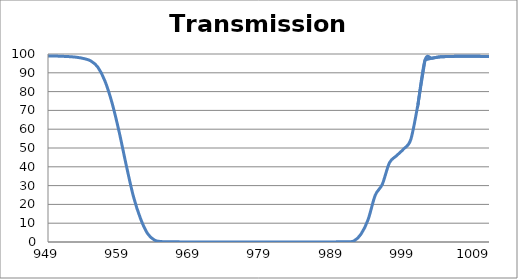
| Category | Transmission (%) |
|---|---|
| 2600.0 | 73.48 |
| 2599.0 | 73.645 |
| 2598.0 | 73.816 |
| 2597.0 | 73.891 |
| 2596.0 | 73.89 |
| 2595.0 | 73.862 |
| 2594.0 | 73.802 |
| 2593.0 | 73.691 |
| 2592.0 | 73.519 |
| 2591.0 | 73.297 |
| 2590.0 | 73.026 |
| 2589.0 | 72.665 |
| 2588.0 | 72.265 |
| 2587.0 | 71.8 |
| 2586.0 | 71.317 |
| 2585.0 | 70.806 |
| 2584.0 | 70.241 |
| 2583.0 | 69.645 |
| 2582.0 | 69.094 |
| 2581.0 | 68.533 |
| 2580.0 | 67.994 |
| 2579.0 | 67.481 |
| 2578.0 | 66.955 |
| 2577.0 | 66.455 |
| 2576.0 | 65.949 |
| 2575.0 | 65.496 |
| 2574.0 | 65.082 |
| 2573.0 | 64.707 |
| 2572.0 | 64.376 |
| 2571.0 | 64.076 |
| 2570.0 | 63.812 |
| 2569.0 | 63.601 |
| 2568.0 | 63.413 |
| 2567.0 | 63.256 |
| 2566.0 | 63.111 |
| 2565.0 | 62.979 |
| 2564.0 | 62.89 |
| 2563.0 | 62.814 |
| 2562.0 | 62.753 |
| 2561.0 | 62.719 |
| 2560.0 | 62.673 |
| 2559.0 | 62.64 |
| 2558.0 | 62.602 |
| 2557.0 | 62.563 |
| 2556.0 | 62.519 |
| 2555.0 | 62.472 |
| 2554.0 | 62.424 |
| 2553.0 | 62.378 |
| 2552.0 | 62.334 |
| 2551.0 | 62.303 |
| 2550.0 | 62.281 |
| 2549.0 | 62.283 |
| 2548.0 | 62.291 |
| 2547.0 | 62.346 |
| 2546.0 | 62.429 |
| 2545.0 | 62.564 |
| 2544.0 | 62.737 |
| 2543.0 | 62.965 |
| 2542.0 | 63.262 |
| 2541.0 | 63.615 |
| 2540.0 | 64.023 |
| 2539.0 | 64.515 |
| 2538.0 | 65.075 |
| 2537.0 | 65.663 |
| 2536.0 | 66.332 |
| 2535.0 | 67.04 |
| 2534.0 | 67.807 |
| 2533.0 | 68.609 |
| 2532.0 | 69.443 |
| 2531.0 | 70.247 |
| 2530.0 | 71.024 |
| 2529.0 | 71.798 |
| 2528.0 | 72.547 |
| 2527.0 | 73.227 |
| 2526.0 | 73.838 |
| 2525.0 | 74.342 |
| 2524.0 | 74.753 |
| 2523.0 | 75.061 |
| 2522.0 | 75.291 |
| 2521.0 | 75.414 |
| 2520.0 | 75.431 |
| 2519.0 | 75.343 |
| 2518.0 | 75.179 |
| 2517.0 | 74.941 |
| 2516.0 | 74.632 |
| 2515.0 | 74.277 |
| 2514.0 | 73.897 |
| 2513.0 | 73.502 |
| 2512.0 | 73.104 |
| 2511.0 | 72.762 |
| 2510.0 | 72.457 |
| 2509.0 | 72.216 |
| 2508.0 | 72.055 |
| 2507.0 | 71.998 |
| 2506.0 | 72.042 |
| 2505.0 | 72.205 |
| 2504.0 | 72.475 |
| 2503.0 | 72.874 |
| 2502.0 | 73.394 |
| 2501.0 | 74.021 |
| 2500.0 | 74.799 |
| 2499.0 | 75.648 |
| 2498.0 | 76.582 |
| 2497.0 | 77.574 |
| 2496.0 | 78.641 |
| 2495.0 | 79.709 |
| 2494.0 | 80.819 |
| 2493.0 | 81.905 |
| 2492.0 | 82.885 |
| 2491.0 | 83.83 |
| 2490.0 | 84.66 |
| 2489.0 | 85.374 |
| 2488.0 | 85.951 |
| 2487.0 | 86.399 |
| 2486.0 | 86.641 |
| 2485.0 | 86.753 |
| 2484.0 | 86.703 |
| 2483.0 | 86.487 |
| 2482.0 | 86.164 |
| 2481.0 | 85.706 |
| 2480.0 | 85.165 |
| 2479.0 | 84.574 |
| 2478.0 | 83.962 |
| 2477.0 | 83.313 |
| 2476.0 | 82.692 |
| 2475.0 | 82.105 |
| 2474.0 | 81.574 |
| 2473.0 | 81.156 |
| 2472.0 | 80.832 |
| 2471.0 | 80.618 |
| 2470.0 | 80.539 |
| 2469.0 | 80.588 |
| 2468.0 | 80.776 |
| 2467.0 | 81.104 |
| 2466.0 | 81.511 |
| 2465.0 | 82.063 |
| 2464.0 | 82.676 |
| 2463.0 | 83.356 |
| 2462.0 | 84.101 |
| 2461.0 | 84.879 |
| 2460.0 | 85.626 |
| 2459.0 | 86.305 |
| 2458.0 | 86.956 |
| 2457.0 | 87.514 |
| 2456.0 | 87.94 |
| 2455.0 | 88.262 |
| 2454.0 | 88.417 |
| 2453.0 | 88.401 |
| 2452.0 | 88.231 |
| 2451.0 | 87.897 |
| 2450.0 | 87.414 |
| 2449.0 | 86.792 |
| 2448.0 | 86.034 |
| 2447.0 | 85.212 |
| 2446.0 | 84.332 |
| 2445.0 | 83.421 |
| 2444.0 | 82.482 |
| 2443.0 | 81.568 |
| 2442.0 | 80.684 |
| 2441.0 | 79.868 |
| 2440.0 | 79.182 |
| 2439.0 | 78.57 |
| 2438.0 | 78.066 |
| 2437.0 | 77.67 |
| 2436.0 | 77.393 |
| 2435.0 | 77.236 |
| 2434.0 | 77.188 |
| 2433.0 | 77.232 |
| 2432.0 | 77.375 |
| 2431.0 | 77.585 |
| 2430.0 | 77.843 |
| 2429.0 | 78.139 |
| 2428.0 | 78.441 |
| 2427.0 | 78.725 |
| 2426.0 | 78.967 |
| 2425.0 | 79.174 |
| 2424.0 | 79.293 |
| 2423.0 | 79.322 |
| 2422.0 | 79.244 |
| 2421.0 | 79.073 |
| 2420.0 | 78.78 |
| 2419.0 | 78.386 |
| 2418.0 | 77.897 |
| 2417.0 | 77.31 |
| 2416.0 | 76.648 |
| 2415.0 | 75.953 |
| 2414.0 | 75.245 |
| 2413.0 | 74.509 |
| 2412.0 | 73.805 |
| 2411.0 | 73.144 |
| 2410.0 | 72.514 |
| 2409.0 | 71.986 |
| 2408.0 | 71.572 |
| 2407.0 | 71.254 |
| 2406.0 | 71.051 |
| 2405.0 | 70.975 |
| 2404.0 | 71.02 |
| 2403.0 | 71.213 |
| 2402.0 | 71.531 |
| 2401.0 | 71.955 |
| 2400.0 | 72.491 |
| 2399.0 | 73.141 |
| 2398.0 | 73.857 |
| 2397.0 | 74.664 |
| 2396.0 | 75.534 |
| 2395.0 | 76.355 |
| 2394.0 | 77.234 |
| 2393.0 | 78.05 |
| 2392.0 | 78.836 |
| 2391.0 | 79.577 |
| 2390.0 | 80.234 |
| 2389.0 | 80.783 |
| 2388.0 | 81.218 |
| 2387.0 | 81.554 |
| 2386.0 | 81.79 |
| 2385.0 | 81.924 |
| 2384.0 | 81.962 |
| 2383.0 | 81.937 |
| 2382.0 | 81.867 |
| 2381.0 | 81.743 |
| 2380.0 | 81.615 |
| 2379.0 | 81.516 |
| 2378.0 | 81.428 |
| 2377.0 | 81.401 |
| 2376.0 | 81.439 |
| 2375.0 | 81.558 |
| 2374.0 | 81.757 |
| 2373.0 | 82.072 |
| 2372.0 | 82.455 |
| 2371.0 | 82.949 |
| 2370.0 | 83.546 |
| 2369.0 | 84.166 |
| 2368.0 | 84.867 |
| 2367.0 | 85.596 |
| 2366.0 | 86.332 |
| 2365.0 | 87.086 |
| 2364.0 | 87.778 |
| 2363.0 | 88.403 |
| 2362.0 | 88.924 |
| 2361.0 | 89.36 |
| 2360.0 | 89.672 |
| 2359.0 | 89.865 |
| 2358.0 | 89.915 |
| 2357.0 | 89.815 |
| 2356.0 | 89.611 |
| 2355.0 | 89.287 |
| 2354.0 | 88.859 |
| 2353.0 | 88.369 |
| 2352.0 | 87.81 |
| 2351.0 | 87.214 |
| 2350.0 | 86.666 |
| 2349.0 | 86.13 |
| 2348.0 | 85.616 |
| 2347.0 | 85.165 |
| 2346.0 | 84.815 |
| 2345.0 | 84.521 |
| 2344.0 | 84.316 |
| 2343.0 | 84.219 |
| 2342.0 | 84.184 |
| 2341.0 | 84.228 |
| 2340.0 | 84.344 |
| 2339.0 | 84.488 |
| 2338.0 | 84.649 |
| 2337.0 | 84.813 |
| 2336.0 | 84.971 |
| 2335.0 | 85.062 |
| 2334.0 | 85.102 |
| 2333.0 | 85.073 |
| 2332.0 | 84.92 |
| 2331.0 | 84.688 |
| 2330.0 | 84.342 |
| 2329.0 | 83.886 |
| 2328.0 | 83.319 |
| 2327.0 | 82.695 |
| 2326.0 | 81.967 |
| 2325.0 | 81.157 |
| 2324.0 | 80.389 |
| 2323.0 | 79.572 |
| 2322.0 | 78.752 |
| 2321.0 | 77.996 |
| 2320.0 | 77.27 |
| 2319.0 | 76.609 |
| 2318.0 | 76.034 |
| 2317.0 | 75.582 |
| 2316.0 | 75.2 |
| 2315.0 | 74.91 |
| 2314.0 | 74.72 |
| 2313.0 | 74.625 |
| 2312.0 | 74.594 |
| 2311.0 | 74.645 |
| 2310.0 | 74.748 |
| 2309.0 | 74.876 |
| 2308.0 | 75.006 |
| 2307.0 | 75.158 |
| 2306.0 | 75.267 |
| 2305.0 | 75.321 |
| 2304.0 | 75.345 |
| 2303.0 | 75.289 |
| 2302.0 | 75.146 |
| 2301.0 | 74.937 |
| 2300.0 | 74.641 |
| 2299.0 | 74.253 |
| 2298.0 | 73.844 |
| 2297.0 | 73.347 |
| 2296.0 | 72.811 |
| 2295.0 | 72.238 |
| 2294.0 | 71.664 |
| 2293.0 | 71.085 |
| 2292.0 | 70.544 |
| 2291.0 | 70.058 |
| 2290.0 | 69.624 |
| 2289.0 | 69.247 |
| 2288.0 | 68.959 |
| 2287.0 | 68.758 |
| 2286.0 | 68.652 |
| 2285.0 | 68.634 |
| 2284.0 | 68.744 |
| 2283.0 | 68.923 |
| 2282.0 | 69.189 |
| 2281.0 | 69.565 |
| 2280.0 | 70.014 |
| 2279.0 | 70.476 |
| 2278.0 | 71.038 |
| 2277.0 | 71.641 |
| 2276.0 | 72.264 |
| 2275.0 | 72.927 |
| 2274.0 | 73.6 |
| 2273.0 | 74.25 |
| 2272.0 | 74.836 |
| 2271.0 | 75.431 |
| 2270.0 | 75.963 |
| 2269.0 | 76.422 |
| 2268.0 | 76.846 |
| 2267.0 | 77.219 |
| 2266.0 | 77.503 |
| 2265.0 | 77.741 |
| 2264.0 | 77.924 |
| 2263.0 | 78.06 |
| 2262.0 | 78.161 |
| 2261.0 | 78.226 |
| 2260.0 | 78.261 |
| 2259.0 | 78.273 |
| 2258.0 | 78.264 |
| 2257.0 | 78.247 |
| 2256.0 | 78.216 |
| 2255.0 | 78.173 |
| 2254.0 | 78.124 |
| 2253.0 | 78.062 |
| 2252.0 | 77.989 |
| 2251.0 | 77.913 |
| 2250.0 | 77.819 |
| 2249.0 | 77.701 |
| 2248.0 | 77.565 |
| 2247.0 | 77.428 |
| 2246.0 | 77.262 |
| 2245.0 | 77.087 |
| 2244.0 | 76.902 |
| 2243.0 | 76.699 |
| 2242.0 | 76.494 |
| 2241.0 | 76.286 |
| 2240.0 | 76.1 |
| 2239.0 | 75.902 |
| 2238.0 | 75.727 |
| 2237.0 | 75.577 |
| 2236.0 | 75.43 |
| 2235.0 | 75.314 |
| 2234.0 | 75.229 |
| 2233.0 | 75.156 |
| 2232.0 | 75.091 |
| 2231.0 | 75.046 |
| 2230.0 | 74.994 |
| 2229.0 | 74.944 |
| 2228.0 | 74.886 |
| 2227.0 | 74.808 |
| 2226.0 | 74.685 |
| 2225.0 | 74.539 |
| 2224.0 | 74.351 |
| 2223.0 | 74.108 |
| 2222.0 | 73.822 |
| 2221.0 | 73.502 |
| 2220.0 | 73.138 |
| 2219.0 | 72.728 |
| 2218.0 | 72.288 |
| 2217.0 | 71.837 |
| 2216.0 | 71.35 |
| 2215.0 | 70.902 |
| 2214.0 | 70.453 |
| 2213.0 | 70.024 |
| 2212.0 | 69.616 |
| 2211.0 | 69.269 |
| 2210.0 | 68.939 |
| 2209.0 | 68.655 |
| 2208.0 | 68.435 |
| 2207.0 | 68.238 |
| 2206.0 | 68.068 |
| 2205.0 | 67.94 |
| 2204.0 | 67.816 |
| 2203.0 | 67.692 |
| 2202.0 | 67.549 |
| 2201.0 | 67.406 |
| 2200.0 | 67.214 |
| 2199.0 | 66.971 |
| 2198.0 | 66.693 |
| 2197.0 | 66.351 |
| 2196.0 | 65.948 |
| 2195.0 | 65.509 |
| 2194.0 | 65.024 |
| 2193.0 | 64.483 |
| 2192.0 | 63.94 |
| 2191.0 | 63.362 |
| 2190.0 | 62.793 |
| 2189.0 | 62.258 |
| 2188.0 | 61.761 |
| 2187.0 | 61.277 |
| 2186.0 | 60.868 |
| 2185.0 | 60.537 |
| 2184.0 | 60.243 |
| 2183.0 | 60.035 |
| 2182.0 | 59.906 |
| 2181.0 | 59.826 |
| 2180.0 | 59.809 |
| 2179.0 | 59.844 |
| 2178.0 | 59.92 |
| 2177.0 | 60.008 |
| 2176.0 | 60.11 |
| 2175.0 | 60.217 |
| 2174.0 | 60.302 |
| 2173.0 | 60.358 |
| 2172.0 | 60.383 |
| 2171.0 | 60.359 |
| 2170.0 | 60.28 |
| 2169.0 | 60.165 |
| 2168.0 | 60.013 |
| 2167.0 | 59.803 |
| 2166.0 | 59.594 |
| 2165.0 | 59.365 |
| 2164.0 | 59.128 |
| 2163.0 | 58.923 |
| 2162.0 | 58.749 |
| 2161.0 | 58.607 |
| 2160.0 | 58.517 |
| 2159.0 | 58.501 |
| 2158.0 | 58.539 |
| 2157.0 | 58.665 |
| 2156.0 | 58.853 |
| 2155.0 | 59.108 |
| 2154.0 | 59.414 |
| 2153.0 | 59.765 |
| 2152.0 | 60.166 |
| 2151.0 | 60.567 |
| 2150.0 | 60.958 |
| 2149.0 | 61.335 |
| 2148.0 | 61.674 |
| 2147.0 | 61.95 |
| 2146.0 | 62.184 |
| 2145.0 | 62.34 |
| 2144.0 | 62.414 |
| 2143.0 | 62.418 |
| 2142.0 | 62.358 |
| 2141.0 | 62.243 |
| 2140.0 | 62.091 |
| 2139.0 | 61.909 |
| 2138.0 | 61.715 |
| 2137.0 | 61.548 |
| 2136.0 | 61.387 |
| 2135.0 | 61.267 |
| 2134.0 | 61.195 |
| 2133.0 | 61.173 |
| 2132.0 | 61.205 |
| 2131.0 | 61.277 |
| 2130.0 | 61.378 |
| 2129.0 | 61.521 |
| 2128.0 | 61.647 |
| 2127.0 | 61.766 |
| 2126.0 | 61.852 |
| 2125.0 | 61.882 |
| 2124.0 | 61.822 |
| 2123.0 | 61.689 |
| 2122.0 | 61.444 |
| 2121.0 | 61.105 |
| 2120.0 | 60.643 |
| 2119.0 | 60.122 |
| 2118.0 | 59.53 |
| 2117.0 | 58.871 |
| 2116.0 | 58.2 |
| 2115.0 | 57.515 |
| 2114.0 | 56.831 |
| 2113.0 | 56.22 |
| 2112.0 | 55.701 |
| 2111.0 | 55.265 |
| 2110.0 | 54.931 |
| 2109.0 | 54.726 |
| 2108.0 | 54.636 |
| 2107.0 | 54.646 |
| 2106.0 | 54.795 |
| 2105.0 | 55.013 |
| 2104.0 | 55.291 |
| 2103.0 | 55.623 |
| 2102.0 | 55.955 |
| 2101.0 | 56.256 |
| 2100.0 | 56.51 |
| 2099.0 | 56.663 |
| 2098.0 | 56.703 |
| 2097.0 | 56.618 |
| 2096.0 | 56.375 |
| 2095.0 | 55.997 |
| 2094.0 | 55.463 |
| 2093.0 | 54.796 |
| 2092.0 | 54.087 |
| 2091.0 | 53.266 |
| 2090.0 | 52.402 |
| 2089.0 | 51.536 |
| 2088.0 | 50.681 |
| 2087.0 | 49.887 |
| 2086.0 | 49.203 |
| 2085.0 | 48.611 |
| 2084.0 | 48.133 |
| 2083.0 | 47.773 |
| 2082.0 | 47.553 |
| 2081.0 | 47.446 |
| 2080.0 | 47.465 |
| 2079.0 | 47.586 |
| 2078.0 | 47.769 |
| 2077.0 | 48.042 |
| 2076.0 | 48.322 |
| 2075.0 | 48.636 |
| 2074.0 | 48.939 |
| 2073.0 | 49.193 |
| 2072.0 | 49.405 |
| 2071.0 | 49.546 |
| 2070.0 | 49.627 |
| 2069.0 | 49.628 |
| 2068.0 | 49.558 |
| 2067.0 | 49.439 |
| 2066.0 | 49.283 |
| 2065.0 | 49.1 |
| 2064.0 | 48.902 |
| 2063.0 | 48.734 |
| 2062.0 | 48.599 |
| 2061.0 | 48.511 |
| 2060.0 | 48.518 |
| 2059.0 | 48.582 |
| 2058.0 | 48.739 |
| 2057.0 | 48.976 |
| 2056.0 | 49.307 |
| 2055.0 | 49.702 |
| 2054.0 | 50.144 |
| 2053.0 | 50.632 |
| 2052.0 | 51.136 |
| 2051.0 | 51.632 |
| 2050.0 | 52.117 |
| 2049.0 | 52.567 |
| 2048.0 | 52.96 |
| 2047.0 | 53.273 |
| 2046.0 | 53.521 |
| 2045.0 | 53.683 |
| 2044.0 | 53.789 |
| 2043.0 | 53.816 |
| 2042.0 | 53.798 |
| 2041.0 | 53.727 |
| 2040.0 | 53.64 |
| 2039.0 | 53.522 |
| 2038.0 | 53.4 |
| 2037.0 | 53.277 |
| 2036.0 | 53.157 |
| 2035.0 | 53.04 |
| 2034.0 | 52.923 |
| 2033.0 | 52.807 |
| 2032.0 | 52.655 |
| 2031.0 | 52.485 |
| 2030.0 | 52.274 |
| 2029.0 | 52.01 |
| 2028.0 | 51.693 |
| 2027.0 | 51.311 |
| 2026.0 | 50.866 |
| 2025.0 | 50.344 |
| 2024.0 | 49.755 |
| 2023.0 | 49.111 |
| 2022.0 | 48.435 |
| 2021.0 | 47.736 |
| 2020.0 | 46.988 |
| 2019.0 | 46.234 |
| 2018.0 | 45.482 |
| 2017.0 | 44.718 |
| 2016.0 | 43.971 |
| 2015.0 | 43.265 |
| 2014.0 | 42.573 |
| 2013.0 | 41.892 |
| 2012.0 | 41.252 |
| 2011.0 | 40.613 |
| 2010.0 | 40 |
| 2009.0 | 39.447 |
| 2008.0 | 38.922 |
| 2007.0 | 38.428 |
| 2006.0 | 37.958 |
| 2005.0 | 37.552 |
| 2004.0 | 37.187 |
| 2003.0 | 36.89 |
| 2002.0 | 36.679 |
| 2001.0 | 36.536 |
| 2000.0 | 36.471 |
| 1999.0 | 36.491 |
| 1998.0 | 36.598 |
| 1997.0 | 36.78 |
| 1996.0 | 37.019 |
| 1995.0 | 37.32 |
| 1994.0 | 37.652 |
| 1993.0 | 37.978 |
| 1992.0 | 38.287 |
| 1991.0 | 38.554 |
| 1990.0 | 38.732 |
| 1989.0 | 38.809 |
| 1988.0 | 38.761 |
| 1987.0 | 38.589 |
| 1986.0 | 38.28 |
| 1985.0 | 37.842 |
| 1984.0 | 37.296 |
| 1983.0 | 36.7 |
| 1982.0 | 36.034 |
| 1981.0 | 35.357 |
| 1980.0 | 34.705 |
| 1979.0 | 34.118 |
| 1978.0 | 33.615 |
| 1977.0 | 33.248 |
| 1976.0 | 33.027 |
| 1975.0 | 32.957 |
| 1974.0 | 33.064 |
| 1973.0 | 33.334 |
| 1972.0 | 33.793 |
| 1971.0 | 34.388 |
| 1970.0 | 35.086 |
| 1969.0 | 35.899 |
| 1968.0 | 36.766 |
| 1967.0 | 37.624 |
| 1966.0 | 38.481 |
| 1965.0 | 39.26 |
| 1964.0 | 39.862 |
| 1963.0 | 40.336 |
| 1962.0 | 40.614 |
| 1961.0 | 40.723 |
| 1960.0 | 40.645 |
| 1959.0 | 40.419 |
| 1958.0 | 40.09 |
| 1957.0 | 39.701 |
| 1956.0 | 39.291 |
| 1955.0 | 38.925 |
| 1954.0 | 38.632 |
| 1953.0 | 38.451 |
| 1952.0 | 38.431 |
| 1951.0 | 38.567 |
| 1950.0 | 38.859 |
| 1949.0 | 39.324 |
| 1948.0 | 39.913 |
| 1947.0 | 40.636 |
| 1946.0 | 41.44 |
| 1945.0 | 42.23 |
| 1944.0 | 43 |
| 1943.0 | 43.7 |
| 1942.0 | 44.296 |
| 1941.0 | 44.753 |
| 1940.0 | 45.045 |
| 1939.0 | 45.177 |
| 1938.0 | 45.166 |
| 1937.0 | 45.017 |
| 1936.0 | 44.8 |
| 1935.0 | 44.529 |
| 1934.0 | 44.26 |
| 1933.0 | 44.025 |
| 1932.0 | 43.872 |
| 1931.0 | 43.803 |
| 1930.0 | 43.819 |
| 1929.0 | 43.919 |
| 1928.0 | 44.088 |
| 1927.0 | 44.296 |
| 1926.0 | 44.494 |
| 1925.0 | 44.651 |
| 1924.0 | 44.719 |
| 1923.0 | 44.665 |
| 1922.0 | 44.485 |
| 1921.0 | 44.133 |
| 1920.0 | 43.624 |
| 1919.0 | 43.063 |
| 1918.0 | 42.412 |
| 1917.0 | 41.715 |
| 1916.0 | 41.006 |
| 1915.0 | 40.346 |
| 1914.0 | 39.767 |
| 1913.0 | 39.279 |
| 1912.0 | 38.946 |
| 1911.0 | 38.719 |
| 1910.0 | 38.645 |
| 1909.0 | 38.709 |
| 1908.0 | 38.873 |
| 1907.0 | 39.089 |
| 1906.0 | 39.337 |
| 1905.0 | 39.544 |
| 1904.0 | 39.689 |
| 1903.0 | 39.713 |
| 1902.0 | 39.589 |
| 1901.0 | 39.292 |
| 1900.0 | 38.857 |
| 1899.0 | 38.298 |
| 1898.0 | 37.655 |
| 1897.0 | 36.943 |
| 1896.0 | 36.262 |
| 1895.0 | 35.581 |
| 1894.0 | 35.01 |
| 1893.0 | 34.563 |
| 1892.0 | 34.223 |
| 1891.0 | 34.026 |
| 1890.0 | 33.987 |
| 1889.0 | 34.1 |
| 1888.0 | 34.355 |
| 1887.0 | 34.705 |
| 1886.0 | 35.122 |
| 1885.0 | 35.576 |
| 1884.0 | 36.002 |
| 1883.0 | 36.393 |
| 1882.0 | 36.692 |
| 1881.0 | 36.875 |
| 1880.0 | 36.933 |
| 1879.0 | 36.889 |
| 1878.0 | 36.755 |
| 1877.0 | 36.565 |
| 1876.0 | 36.362 |
| 1875.0 | 36.175 |
| 1874.0 | 36.07 |
| 1873.0 | 36.051 |
| 1872.0 | 36.172 |
| 1871.0 | 36.44 |
| 1870.0 | 36.842 |
| 1869.0 | 37.361 |
| 1868.0 | 37.97 |
| 1867.0 | 38.597 |
| 1866.0 | 39.245 |
| 1865.0 | 39.822 |
| 1864.0 | 40.298 |
| 1863.0 | 40.685 |
| 1862.0 | 40.88 |
| 1861.0 | 40.891 |
| 1860.0 | 40.724 |
| 1859.0 | 40.415 |
| 1858.0 | 40.002 |
| 1857.0 | 39.485 |
| 1856.0 | 38.953 |
| 1855.0 | 38.475 |
| 1854.0 | 38.068 |
| 1853.0 | 37.752 |
| 1852.0 | 37.53 |
| 1851.0 | 37.432 |
| 1850.0 | 37.427 |
| 1849.0 | 37.484 |
| 1848.0 | 37.567 |
| 1847.0 | 37.654 |
| 1846.0 | 37.695 |
| 1845.0 | 37.648 |
| 1844.0 | 37.472 |
| 1843.0 | 37.177 |
| 1842.0 | 36.763 |
| 1841.0 | 36.25 |
| 1840.0 | 35.65 |
| 1839.0 | 34.998 |
| 1838.0 | 34.375 |
| 1837.0 | 33.781 |
| 1836.0 | 33.323 |
| 1835.0 | 32.949 |
| 1834.0 | 32.681 |
| 1833.0 | 32.523 |
| 1832.0 | 32.469 |
| 1831.0 | 32.494 |
| 1830.0 | 32.57 |
| 1829.0 | 32.64 |
| 1828.0 | 32.683 |
| 1827.0 | 32.674 |
| 1826.0 | 32.569 |
| 1825.0 | 32.373 |
| 1824.0 | 32.071 |
| 1823.0 | 31.672 |
| 1822.0 | 31.22 |
| 1821.0 | 30.713 |
| 1820.0 | 30.221 |
| 1819.0 | 29.763 |
| 1818.0 | 29.384 |
| 1817.0 | 29.128 |
| 1816.0 | 28.99 |
| 1815.0 | 28.954 |
| 1814.0 | 29.041 |
| 1813.0 | 29.218 |
| 1812.0 | 29.471 |
| 1811.0 | 29.768 |
| 1810.0 | 30.065 |
| 1809.0 | 30.355 |
| 1808.0 | 30.581 |
| 1807.0 | 30.761 |
| 1806.0 | 30.855 |
| 1805.0 | 30.875 |
| 1804.0 | 30.842 |
| 1803.0 | 30.783 |
| 1802.0 | 30.718 |
| 1801.0 | 30.692 |
| 1800.0 | 30.738 |
| 1799.0 | 30.869 |
| 1798.0 | 31.112 |
| 1797.0 | 31.451 |
| 1796.0 | 31.889 |
| 1795.0 | 32.418 |
| 1794.0 | 32.994 |
| 1793.0 | 33.599 |
| 1792.0 | 34.193 |
| 1791.0 | 34.704 |
| 1790.0 | 35.138 |
| 1789.0 | 35.482 |
| 1788.0 | 35.727 |
| 1787.0 | 35.895 |
| 1786.0 | 35.999 |
| 1785.0 | 36.087 |
| 1784.0 | 36.197 |
| 1783.0 | 36.366 |
| 1782.0 | 36.616 |
| 1781.0 | 36.941 |
| 1780.0 | 37.381 |
| 1779.0 | 37.861 |
| 1778.0 | 38.345 |
| 1777.0 | 38.797 |
| 1776.0 | 39.159 |
| 1775.0 | 39.375 |
| 1774.0 | 39.415 |
| 1773.0 | 39.256 |
| 1772.0 | 38.923 |
| 1771.0 | 38.465 |
| 1770.0 | 37.926 |
| 1769.0 | 37.362 |
| 1768.0 | 36.889 |
| 1767.0 | 36.515 |
| 1766.0 | 36.324 |
| 1765.0 | 36.33 |
| 1764.0 | 36.524 |
| 1763.0 | 36.856 |
| 1762.0 | 37.279 |
| 1761.0 | 37.724 |
| 1760.0 | 38.062 |
| 1759.0 | 38.202 |
| 1758.0 | 38.083 |
| 1757.0 | 37.66 |
| 1756.0 | 36.921 |
| 1755.0 | 35.927 |
| 1754.0 | 34.727 |
| 1753.0 | 33.446 |
| 1752.0 | 32.251 |
| 1751.0 | 31.167 |
| 1750.0 | 30.255 |
| 1749.0 | 29.599 |
| 1748.0 | 29.217 |
| 1747.0 | 29.096 |
| 1746.0 | 29.197 |
| 1745.0 | 29.468 |
| 1744.0 | 29.817 |
| 1743.0 | 30.155 |
| 1742.0 | 30.37 |
| 1741.0 | 30.374 |
| 1740.0 | 30.1 |
| 1739.0 | 29.555 |
| 1738.0 | 28.755 |
| 1737.0 | 27.721 |
| 1736.0 | 26.61 |
| 1735.0 | 25.468 |
| 1734.0 | 24.448 |
| 1733.0 | 23.632 |
| 1732.0 | 23.056 |
| 1731.0 | 22.76 |
| 1730.0 | 22.768 |
| 1729.0 | 23.105 |
| 1728.0 | 23.776 |
| 1727.0 | 24.721 |
| 1726.0 | 25.904 |
| 1725.0 | 27.25 |
| 1724.0 | 28.686 |
| 1723.0 | 30.003 |
| 1722.0 | 31.185 |
| 1721.0 | 31.984 |
| 1720.0 | 32.376 |
| 1719.0 | 32.389 |
| 1718.0 | 32.05 |
| 1717.0 | 31.492 |
| 1716.0 | 30.82 |
| 1715.0 | 30.206 |
| 1714.0 | 29.764 |
| 1713.0 | 29.576 |
| 1712.0 | 29.691 |
| 1711.0 | 30.145 |
| 1710.0 | 30.944 |
| 1709.0 | 32.072 |
| 1708.0 | 33.432 |
| 1707.0 | 34.92 |
| 1706.0 | 36.458 |
| 1705.0 | 37.972 |
| 1704.0 | 39.232 |
| 1703.0 | 40.302 |
| 1702.0 | 41.025 |
| 1701.0 | 41.409 |
| 1700.0 | 41.555 |
| 1699.0 | 41.537 |
| 1698.0 | 41.452 |
| 1697.0 | 41.368 |
| 1696.0 | 41.366 |
| 1695.0 | 41.489 |
| 1694.0 | 41.704 |
| 1693.0 | 42.037 |
| 1692.0 | 42.43 |
| 1691.0 | 42.827 |
| 1690.0 | 43.21 |
| 1689.0 | 43.545 |
| 1688.0 | 43.802 |
| 1687.0 | 44.024 |
| 1686.0 | 44.222 |
| 1685.0 | 44.41 |
| 1684.0 | 44.603 |
| 1683.0 | 44.781 |
| 1682.0 | 44.894 |
| 1681.0 | 44.878 |
| 1680.0 | 44.665 |
| 1679.0 | 44.163 |
| 1678.0 | 43.343 |
| 1677.0 | 42.157 |
| 1676.0 | 40.698 |
| 1675.0 | 39.156 |
| 1674.0 | 37.481 |
| 1673.0 | 35.91 |
| 1672.0 | 34.585 |
| 1671.0 | 33.565 |
| 1670.0 | 32.98 |
| 1669.0 | 32.85 |
| 1668.0 | 33.169 |
| 1667.0 | 33.923 |
| 1666.0 | 35.025 |
| 1665.0 | 36.317 |
| 1664.0 | 37.601 |
| 1663.0 | 38.577 |
| 1662.0 | 39.037 |
| 1661.0 | 38.838 |
| 1660.0 | 37.92 |
| 1659.0 | 36.431 |
| 1658.0 | 34.449 |
| 1657.0 | 32.342 |
| 1656.0 | 30.523 |
| 1655.0 | 28.921 |
| 1654.0 | 27.803 |
| 1653.0 | 27.229 |
| 1652.0 | 27.244 |
| 1651.0 | 27.883 |
| 1650.0 | 29.114 |
| 1649.0 | 30.819 |
| 1648.0 | 32.986 |
| 1647.0 | 35.299 |
| 1646.0 | 37.463 |
| 1645.0 | 39.205 |
| 1644.0 | 40.152 |
| 1643.0 | 40.212 |
| 1642.0 | 39.447 |
| 1641.0 | 38.04 |
| 1640.0 | 36.405 |
| 1639.0 | 34.753 |
| 1638.0 | 33.49 |
| 1637.0 | 32.825 |
| 1636.0 | 32.803 |
| 1635.0 | 33.487 |
| 1634.0 | 34.872 |
| 1633.0 | 36.909 |
| 1632.0 | 39.484 |
| 1631.0 | 42.211 |
| 1630.0 | 44.684 |
| 1629.0 | 46.726 |
| 1628.0 | 47.919 |
| 1627.0 | 48.192 |
| 1626.0 | 47.626 |
| 1625.0 | 46.531 |
| 1624.0 | 45.318 |
| 1623.0 | 44.301 |
| 1622.0 | 43.745 |
| 1621.0 | 43.821 |
| 1620.0 | 44.573 |
| 1619.0 | 45.883 |
| 1618.0 | 47.385 |
| 1617.0 | 48.779 |
| 1616.0 | 49.629 |
| 1615.0 | 49.591 |
| 1614.0 | 48.502 |
| 1613.0 | 46.365 |
| 1612.0 | 43.556 |
| 1611.0 | 40.687 |
| 1610.0 | 37.804 |
| 1609.0 | 35.495 |
| 1608.0 | 33.873 |
| 1607.0 | 33.002 |
| 1606.0 | 32.979 |
| 1605.0 | 33.708 |
| 1604.0 | 35.095 |
| 1603.0 | 37.071 |
| 1602.0 | 39.24 |
| 1601.0 | 41.377 |
| 1600.0 | 43 |
| 1599.0 | 43.694 |
| 1598.0 | 43.379 |
| 1597.0 | 42.133 |
| 1596.0 | 40.188 |
| 1595.0 | 38.052 |
| 1594.0 | 35.939 |
| 1593.0 | 34.275 |
| 1592.0 | 33.287 |
| 1591.0 | 32.923 |
| 1590.0 | 33.279 |
| 1589.0 | 34.305 |
| 1588.0 | 35.945 |
| 1587.0 | 38.139 |
| 1586.0 | 40.568 |
| 1585.0 | 42.979 |
| 1584.0 | 45.254 |
| 1583.0 | 47.091 |
| 1582.0 | 48.339 |
| 1581.0 | 49.033 |
| 1580.0 | 49.276 |
| 1579.0 | 49.316 |
| 1578.0 | 49.393 |
| 1577.0 | 49.702 |
| 1576.0 | 50.337 |
| 1575.0 | 51.377 |
| 1574.0 | 52.737 |
| 1573.0 | 54.135 |
| 1572.0 | 55.579 |
| 1571.0 | 56.823 |
| 1570.0 | 57.765 |
| 1569.0 | 58.328 |
| 1568.0 | 58.569 |
| 1567.0 | 58.615 |
| 1566.0 | 58.613 |
| 1565.0 | 58.678 |
| 1564.0 | 58.881 |
| 1563.0 | 59.173 |
| 1562.0 | 59.424 |
| 1561.0 | 59.438 |
| 1560.0 | 59.053 |
| 1559.0 | 58.105 |
| 1558.0 | 56.571 |
| 1557.0 | 54.63 |
| 1556.0 | 52.341 |
| 1555.0 | 50.112 |
| 1554.0 | 48.276 |
| 1553.0 | 46.907 |
| 1552.0 | 46.218 |
| 1551.0 | 46.264 |
| 1550.0 | 47.051 |
| 1549.0 | 48.579 |
| 1548.0 | 50.581 |
| 1547.0 | 52.719 |
| 1546.0 | 54.792 |
| 1545.0 | 56.331 |
| 1544.0 | 57.04 |
| 1543.0 | 56.744 |
| 1542.0 | 55.582 |
| 1541.0 | 53.877 |
| 1540.0 | 51.982 |
| 1539.0 | 50.244 |
| 1538.0 | 49.017 |
| 1537.0 | 48.45 |
| 1536.0 | 48.669 |
| 1535.0 | 49.626 |
| 1534.0 | 51.296 |
| 1533.0 | 53.458 |
| 1532.0 | 55.927 |
| 1531.0 | 58.353 |
| 1530.0 | 60.519 |
| 1529.0 | 62.029 |
| 1528.0 | 62.816 |
| 1527.0 | 63.036 |
| 1526.0 | 62.773 |
| 1525.0 | 62.319 |
| 1524.0 | 61.935 |
| 1523.0 | 61.788 |
| 1522.0 | 62.013 |
| 1521.0 | 62.581 |
| 1520.0 | 63.457 |
| 1519.0 | 64.441 |
| 1518.0 | 65.451 |
| 1517.0 | 66.289 |
| 1516.0 | 66.846 |
| 1515.0 | 67.138 |
| 1514.0 | 67.223 |
| 1513.0 | 67.183 |
| 1512.0 | 67.175 |
| 1511.0 | 67.293 |
| 1510.0 | 67.577 |
| 1509.0 | 67.965 |
| 1508.0 | 68.442 |
| 1507.0 | 68.846 |
| 1506.0 | 69.046 |
| 1505.0 | 68.973 |
| 1504.0 | 68.566 |
| 1503.0 | 67.906 |
| 1502.0 | 67.157 |
| 1501.0 | 66.42 |
| 1500.0 | 65.888 |
| 1499.0 | 65.733 |
| 1498.0 | 66.032 |
| 1497.0 | 66.782 |
| 1496.0 | 67.881 |
| 1495.0 | 69.194 |
| 1494.0 | 70.564 |
| 1493.0 | 71.671 |
| 1492.0 | 72.423 |
| 1491.0 | 72.618 |
| 1490.0 | 72.297 |
| 1489.0 | 71.589 |
| 1488.0 | 70.686 |
| 1487.0 | 69.801 |
| 1486.0 | 69.148 |
| 1485.0 | 68.887 |
| 1484.0 | 69.076 |
| 1483.0 | 69.623 |
| 1482.0 | 70.517 |
| 1481.0 | 71.577 |
| 1480.0 | 72.547 |
| 1479.0 | 73.31 |
| 1478.0 | 73.695 |
| 1477.0 | 73.658 |
| 1476.0 | 73.323 |
| 1475.0 | 72.793 |
| 1474.0 | 72.271 |
| 1473.0 | 71.892 |
| 1472.0 | 71.812 |
| 1471.0 | 72.057 |
| 1470.0 | 72.587 |
| 1469.0 | 73.329 |
| 1468.0 | 74.138 |
| 1467.0 | 74.821 |
| 1466.0 | 75.31 |
| 1465.0 | 75.461 |
| 1464.0 | 75.337 |
| 1463.0 | 75.019 |
| 1462.0 | 74.663 |
| 1461.0 | 74.401 |
| 1460.0 | 74.375 |
| 1459.0 | 74.654 |
| 1458.0 | 75.191 |
| 1457.0 | 75.914 |
| 1456.0 | 76.713 |
| 1455.0 | 77.406 |
| 1454.0 | 77.885 |
| 1453.0 | 78.078 |
| 1452.0 | 78.011 |
| 1451.0 | 77.791 |
| 1450.0 | 77.576 |
| 1449.0 | 77.502 |
| 1448.0 | 77.672 |
| 1447.0 | 78.154 |
| 1446.0 | 78.918 |
| 1445.0 | 79.751 |
| 1444.0 | 80.572 |
| 1443.0 | 81.16 |
| 1442.0 | 81.414 |
| 1441.0 | 81.323 |
| 1440.0 | 80.948 |
| 1439.0 | 80.496 |
| 1438.0 | 80.139 |
| 1437.0 | 80.034 |
| 1436.0 | 80.314 |
| 1435.0 | 80.956 |
| 1434.0 | 81.892 |
| 1433.0 | 82.882 |
| 1432.0 | 83.728 |
| 1431.0 | 84.216 |
| 1430.0 | 84.265 |
| 1429.0 | 83.888 |
| 1428.0 | 83.189 |
| 1427.0 | 82.447 |
| 1426.0 | 81.931 |
| 1425.0 | 81.765 |
| 1424.0 | 82.037 |
| 1423.0 | 82.728 |
| 1422.0 | 83.663 |
| 1421.0 | 84.638 |
| 1420.0 | 85.436 |
| 1419.0 | 85.859 |
| 1418.0 | 85.89 |
| 1417.0 | 85.599 |
| 1416.0 | 85.164 |
| 1415.0 | 84.748 |
| 1414.0 | 84.566 |
| 1413.0 | 84.708 |
| 1412.0 | 85.143 |
| 1411.0 | 85.76 |
| 1410.0 | 86.441 |
| 1409.0 | 86.997 |
| 1408.0 | 87.296 |
| 1407.0 | 87.352 |
| 1406.0 | 87.254 |
| 1405.0 | 87.121 |
| 1404.0 | 87.105 |
| 1403.0 | 87.273 |
| 1402.0 | 87.572 |
| 1401.0 | 87.899 |
| 1400.0 | 88.055 |
| 1399.0 | 87.889 |
| 1398.0 | 87.309 |
| 1397.0 | 86.399 |
| 1396.0 | 85.241 |
| 1395.0 | 84.259 |
| 1394.0 | 83.769 |
| 1393.0 | 83.974 |
| 1392.0 | 84.878 |
| 1391.0 | 86.355 |
| 1390.0 | 88.119 |
| 1389.0 | 89.753 |
| 1388.0 | 90.811 |
| 1387.0 | 91.06 |
| 1386.0 | 90.432 |
| 1385.0 | 89.195 |
| 1384.0 | 87.743 |
| 1383.0 | 86.553 |
| 1382.0 | 86.061 |
| 1381.0 | 86.417 |
| 1380.0 | 87.611 |
| 1379.0 | 89.178 |
| 1378.0 | 90.777 |
| 1377.0 | 91.894 |
| 1376.0 | 92.178 |
| 1375.0 | 91.533 |
| 1374.0 | 90.256 |
| 1373.0 | 88.759 |
| 1372.0 | 87.563 |
| 1371.0 | 87.061 |
| 1370.0 | 87.467 |
| 1369.0 | 88.66 |
| 1368.0 | 90.352 |
| 1367.0 | 91.975 |
| 1366.0 | 93.123 |
| 1365.0 | 93.392 |
| 1364.0 | 92.864 |
| 1363.0 | 91.711 |
| 1362.0 | 90.48 |
| 1361.0 | 89.515 |
| 1360.0 | 89.235 |
| 1359.0 | 89.781 |
| 1358.0 | 90.966 |
| 1357.0 | 92.422 |
| 1356.0 | 93.63 |
| 1355.0 | 94.17 |
| 1354.0 | 93.843 |
| 1353.0 | 92.702 |
| 1352.0 | 91.066 |
| 1351.0 | 89.434 |
| 1350.0 | 88.395 |
| 1349.0 | 88.144 |
| 1348.0 | 88.817 |
| 1347.0 | 90.281 |
| 1346.0 | 92.125 |
| 1345.0 | 94.049 |
| 1344.0 | 95.513 |
| 1343.0 | 96.216 |
| 1342.0 | 96.205 |
| 1341.0 | 95.637 |
| 1340.0 | 94.862 |
| 1339.0 | 94.164 |
| 1338.0 | 93.866 |
| 1337.0 | 94.052 |
| 1336.0 | 94.612 |
| 1335.0 | 95.487 |
| 1334.0 | 96.434 |
| 1333.0 | 97.307 |
| 1332.0 | 97.988 |
| 1331.0 | 98.418 |
| 1330.0 | 98.648 |
| 1329.0 | 98.714 |
| 1328.0 | 98.753 |
| 1327.0 | 98.742 |
| 1326.0 | 98.734 |
| 1325.0 | 98.733 |
| 1324.0 | 98.74 |
| 1323.0 | 98.731 |
| 1322.0 | 98.725 |
| 1321.0 | 98.758 |
| 1320.0 | 98.815 |
| 1319.0 | 98.909 |
| 1318.0 | 99.024 |
| 1317.0 | 99.105 |
| 1316.0 | 99.183 |
| 1315.0 | 99.223 |
| 1314.0 | 99.231 |
| 1313.0 | 99.207 |
| 1312.0 | 99.2 |
| 1311.0 | 99.218 |
| 1310.0 | 99.225 |
| 1309.0 | 99.266 |
| 1308.0 | 99.302 |
| 1307.0 | 99.32 |
| 1306.0 | 99.344 |
| 1305.0 | 99.354 |
| 1304.0 | 99.389 |
| 1303.0 | 99.422 |
| 1302.0 | 99.471 |
| 1301.0 | 99.515 |
| 1300.0 | 99.525 |
| 1299.0 | 99.522 |
| 1298.0 | 99.483 |
| 1297.0 | 99.413 |
| 1296.0 | 99.346 |
| 1295.0 | 99.323 |
| 1294.0 | 99.321 |
| 1293.0 | 99.344 |
| 1292.0 | 99.392 |
| 1291.0 | 99.447 |
| 1290.0 | 99.48 |
| 1289.0 | 99.521 |
| 1288.0 | 99.535 |
| 1287.0 | 99.545 |
| 1286.0 | 99.557 |
| 1285.0 | 99.578 |
| 1284.0 | 99.578 |
| 1283.0 | 99.566 |
| 1282.0 | 99.547 |
| 1281.0 | 99.511 |
| 1280.0 | 99.462 |
| 1279.0 | 99.449 |
| 1278.0 | 99.424 |
| 1277.0 | 99.417 |
| 1276.0 | 99.446 |
| 1275.0 | 99.473 |
| 1274.0 | 99.484 |
| 1273.0 | 99.493 |
| 1272.0 | 99.501 |
| 1271.0 | 99.506 |
| 1270.0 | 99.515 |
| 1269.0 | 99.542 |
| 1268.0 | 99.565 |
| 1267.0 | 99.571 |
| 1266.0 | 99.573 |
| 1265.0 | 99.533 |
| 1264.0 | 99.495 |
| 1263.0 | 99.475 |
| 1262.0 | 99.473 |
| 1261.0 | 99.49 |
| 1260.0 | 99.529 |
| 1259.0 | 99.567 |
| 1258.0 | 99.574 |
| 1257.0 | 99.561 |
| 1256.0 | 99.522 |
| 1255.0 | 99.464 |
| 1254.0 | 99.414 |
| 1253.0 | 99.392 |
| 1252.0 | 99.398 |
| 1251.0 | 99.399 |
| 1250.0 | 99.412 |
| 1249.0 | 99.429 |
| 1248.0 | 99.391 |
| 1247.0 | 99.367 |
| 1246.0 | 99.368 |
| 1245.0 | 99.36 |
| 1244.0 | 99.354 |
| 1243.0 | 99.395 |
| 1242.0 | 99.399 |
| 1241.0 | 99.396 |
| 1240.0 | 99.387 |
| 1239.0 | 99.385 |
| 1238.0 | 99.379 |
| 1237.0 | 99.408 |
| 1236.0 | 99.415 |
| 1235.0 | 99.403 |
| 1234.0 | 99.388 |
| 1233.0 | 99.363 |
| 1232.0 | 99.34 |
| 1231.0 | 99.3 |
| 1230.0 | 99.321 |
| 1229.0 | 99.35 |
| 1228.0 | 99.374 |
| 1227.0 | 99.377 |
| 1226.0 | 99.363 |
| 1225.0 | 99.315 |
| 1224.0 | 99.279 |
| 1223.0 | 99.254 |
| 1222.0 | 99.257 |
| 1221.0 | 99.285 |
| 1220.0 | 99.331 |
| 1219.0 | 99.375 |
| 1218.0 | 99.363 |
| 1217.0 | 99.356 |
| 1216.0 | 99.345 |
| 1215.0 | 99.298 |
| 1214.0 | 99.303 |
| 1213.0 | 99.331 |
| 1212.0 | 99.328 |
| 1211.0 | 99.338 |
| 1210.0 | 99.332 |
| 1209.0 | 99.299 |
| 1208.0 | 99.269 |
| 1207.0 | 99.287 |
| 1206.0 | 99.285 |
| 1205.0 | 99.29 |
| 1204.0 | 99.343 |
| 1203.0 | 99.346 |
| 1202.0 | 99.325 |
| 1201.0 | 99.306 |
| 1200.0 | 99.299 |
| 1199.0 | 99.299 |
| 1198.0 | 99.329 |
| 1197.0 | 99.366 |
| 1196.0 | 99.377 |
| 1195.0 | 99.356 |
| 1194.0 | 99.321 |
| 1193.0 | 99.305 |
| 1192.0 | 99.29 |
| 1191.0 | 99.32 |
| 1190.0 | 99.359 |
| 1189.0 | 99.357 |
| 1188.0 | 99.326 |
| 1187.0 | 99.296 |
| 1186.0 | 99.24 |
| 1185.0 | 99.209 |
| 1184.0 | 99.255 |
| 1183.0 | 99.318 |
| 1182.0 | 99.37 |
| 1181.0 | 99.393 |
| 1180.0 | 99.386 |
| 1179.0 | 99.325 |
| 1178.0 | 99.295 |
| 1177.0 | 99.319 |
| 1176.0 | 99.367 |
| 1175.0 | 99.418 |
| 1174.0 | 99.468 |
| 1173.0 | 99.469 |
| 1172.0 | 99.423 |
| 1171.0 | 99.378 |
| 1170.0 | 99.367 |
| 1169.0 | 99.376 |
| 1168.0 | 99.411 |
| 1167.0 | 99.444 |
| 1166.0 | 99.43 |
| 1165.0 | 99.395 |
| 1164.0 | 99.397 |
| 1163.0 | 99.396 |
| 1162.0 | 99.429 |
| 1161.0 | 99.474 |
| 1160.0 | 99.499 |
| 1159.0 | 99.468 |
| 1158.0 | 99.431 |
| 1157.0 | 99.41 |
| 1156.0 | 99.396 |
| 1155.0 | 99.454 |
| 1154.0 | 99.523 |
| 1153.0 | 99.559 |
| 1152.0 | 99.557 |
| 1151.0 | 99.527 |
| 1150.0 | 99.512 |
| 1149.0 | 99.494 |
| 1148.0 | 99.548 |
| 1147.0 | 99.598 |
| 1146.0 | 99.594 |
| 1145.0 | 99.578 |
| 1144.0 | 99.538 |
| 1143.0 | 99.487 |
| 1142.0 | 99.473 |
| 1141.0 | 99.52 |
| 1140.0 | 99.543 |
| 1139.0 | 99.532 |
| 1138.0 | 99.516 |
| 1137.0 | 99.478 |
| 1136.0 | 99.461 |
| 1135.0 | 99.496 |
| 1134.0 | 99.536 |
| 1133.0 | 99.559 |
| 1132.0 | 99.563 |
| 1131.0 | 99.551 |
| 1130.0 | 99.527 |
| 1129.0 | 99.529 |
| 1128.0 | 99.581 |
| 1127.0 | 99.616 |
| 1126.0 | 99.632 |
| 1125.0 | 99.602 |
| 1124.0 | 99.571 |
| 1123.0 | 99.55 |
| 1122.0 | 99.574 |
| 1121.0 | 99.623 |
| 1120.0 | 99.635 |
| 1119.0 | 99.613 |
| 1118.0 | 99.548 |
| 1117.0 | 99.489 |
| 1116.0 | 99.485 |
| 1115.0 | 99.539 |
| 1114.0 | 99.594 |
| 1113.0 | 99.606 |
| 1112.0 | 99.573 |
| 1111.0 | 99.525 |
| 1110.0 | 99.495 |
| 1109.0 | 99.513 |
| 1108.0 | 99.578 |
| 1107.0 | 99.586 |
| 1106.0 | 99.57 |
| 1105.0 | 99.504 |
| 1104.0 | 99.466 |
| 1103.0 | 99.457 |
| 1102.0 | 99.518 |
| 1101.0 | 99.574 |
| 1100.0 | 99.576 |
| 1099.0 | 99.545 |
| 1098.0 | 99.501 |
| 1097.0 | 99.48 |
| 1096.0 | 99.502 |
| 1095.0 | 99.547 |
| 1094.0 | 99.525 |
| 1093.0 | 99.466 |
| 1092.0 | 99.427 |
| 1091.0 | 99.413 |
| 1090.0 | 99.456 |
| 1089.0 | 99.519 |
| 1088.0 | 99.522 |
| 1087.0 | 99.485 |
| 1086.0 | 99.457 |
| 1085.0 | 99.461 |
| 1084.0 | 99.485 |
| 1083.0 | 99.51 |
| 1082.0 | 99.521 |
| 1081.0 | 99.467 |
| 1080.0 | 99.41 |
| 1079.0 | 99.408 |
| 1078.0 | 99.427 |
| 1077.0 | 99.472 |
| 1076.0 | 99.456 |
| 1075.0 | 99.384 |
| 1074.0 | 99.318 |
| 1073.0 | 99.313 |
| 1072.0 | 99.379 |
| 1071.0 | 99.43 |
| 1070.0 | 99.42 |
| 1069.0 | 99.375 |
| 1068.0 | 99.33 |
| 1067.0 | 99.325 |
| 1066.0 | 99.371 |
| 1065.0 | 99.43 |
| 1064.0 | 99.406 |
| 1063.0 | 99.365 |
| 1062.0 | 99.336 |
| 1061.0 | 99.34 |
| 1060.0 | 99.366 |
| 1059.0 | 99.41 |
| 1058.0 | 99.357 |
| 1057.0 | 99.324 |
| 1056.0 | 99.305 |
| 1055.0 | 99.337 |
| 1054.0 | 99.359 |
| 1053.0 | 99.339 |
| 1052.0 | 99.266 |
| 1051.0 | 99.222 |
| 1050.0 | 99.26 |
| 1049.0 | 99.291 |
| 1048.0 | 99.295 |
| 1047.0 | 99.242 |
| 1046.0 | 99.18 |
| 1045.0 | 99.146 |
| 1044.0 | 99.19 |
| 1043.0 | 99.247 |
| 1042.0 | 99.26 |
| 1041.0 | 99.226 |
| 1040.0 | 99.196 |
| 1039.0 | 99.197 |
| 1038.0 | 99.223 |
| 1037.0 | 99.228 |
| 1036.0 | 99.191 |
| 1035.0 | 99.169 |
| 1034.0 | 99.169 |
| 1033.0 | 99.199 |
| 1032.0 | 99.202 |
| 1031.0 | 99.17 |
| 1030.0 | 99.179 |
| 1029.0 | 99.194 |
| 1028.0 | 99.211 |
| 1027.0 | 99.194 |
| 1026.0 | 99.145 |
| 1025.0 | 99.091 |
| 1024.0 | 99.081 |
| 1023.0 | 99.067 |
| 1022.0 | 99.009 |
| 1021.0 | 98.933 |
| 1020.0 | 98.917 |
| 1019.0 | 98.948 |
| 1018.0 | 98.957 |
| 1017.0 | 98.911 |
| 1016.0 | 98.833 |
| 1015.0 | 98.803 |
| 1014.0 | 98.827 |
| 1013.0 | 98.8 |
| 1012.0 | 98.745 |
| 1011.0 | 98.699 |
| 1010.0 | 98.718 |
| 1009.0 | 98.806 |
| 1008.0 | 98.86 |
| 1007.0 | 98.826 |
| 1006.0 | 98.726 |
| 1005.0 | 98.632 |
| 1004.0 | 98.447 |
| 1003.0 | 97.763 |
| 1002.0 | 96.717 |
| 1001.0 | 72.894 |
| 1000.0 | 54.45 |
| 999.0 | 49.486 |
| 998.0 | 45.897 |
| 997.0 | 42.102 |
| 996.0 | 30.697 |
| 995.0 | 24.826 |
| 994.0 | 11.867 |
| 993.0 | 4.159 |
| 992.0 | 0.552 |
| 991.0 | 0.148 |
| 990.0 | 0.123 |
| 989.0 | 0.016 |
| 988.0 | 0.008 |
| 987.0 | 0.005 |
| 986.0 | 0.002 |
| 985.0 | 0.001 |
| 984.0 | 0.001 |
| 983.0 | 0 |
| 982.0 | 0 |
| 981.0 | 0 |
| 980.0 | 0 |
| 979.0 | 0 |
| 978.0 | 0 |
| 977.0 | 0 |
| 976.0 | 0 |
| 975.0 | 0 |
| 974.0 | 0.001 |
| 973.0 | 0.001 |
| 972.0 | 0.001 |
| 971.0 | 0.001 |
| 970.0 | 0.002 |
| 969.0 | 0.008 |
| 968.0 | 0.018 |
| 967.0 | 0.115 |
| 966.0 | 0.13 |
| 965.0 | 0.212 |
| 964.0 | 0.948 |
| 963.0 | 4.479 |
| 962.0 | 12.511 |
| 961.0 | 24.365 |
| 960.0 | 40.858 |
| 959.0 | 58.614 |
| 958.0 | 74.038 |
| 957.0 | 85.678 |
| 956.0 | 93.044 |
| 955.0 | 96.358 |
| 954.0 | 97.601 |
| 953.0 | 98.272 |
| 952.0 | 98.598 |
| 951.0 | 98.774 |
| 950.0 | 98.913 |
| 949.0 | 98.931 |
| 948.0 | 98.865 |
| 947.0 | 98.845 |
| 946.0 | 98.851 |
| 945.0 | 98.85 |
| 944.0 | 98.87 |
| 943.0 | 98.907 |
| 942.0 | 98.938 |
| 941.0 | 98.951 |
| 940.0 | 98.946 |
| 939.0 | 98.966 |
| 938.0 | 98.977 |
| 937.0 | 98.979 |
| 936.0 | 98.973 |
| 935.0 | 98.971 |
| 934.0 | 98.974 |
| 933.0 | 98.954 |
| 932.0 | 98.935 |
| 931.0 | 98.951 |
| 930.0 | 98.963 |
| 929.0 | 98.964 |
| 928.0 | 98.959 |
| 927.0 | 98.982 |
| 926.0 | 99.002 |
| 925.0 | 99.02 |
| 924.0 | 99.029 |
| 923.0 | 99.061 |
| 922.0 | 99.1 |
| 921.0 | 99.124 |
| 920.0 | 99.119 |
| 919.0 | 99.126 |
| 918.0 | 99.137 |
| 917.0 | 99.125 |
| 916.0 | 99.093 |
| 915.0 | 99.087 |
| 914.0 | 99.078 |
| 913.0 | 99.07 |
| 912.0 | 99.067 |
| 911.0 | 99.069 |
| 910.0 | 99.088 |
| 909.0 | 99.1 |
| 908.0 | 99.101 |
| 907.0 | 99.115 |
| 906.0 | 99.119 |
| 905.0 | 99.141 |
| 904.0 | 99.143 |
| 903.0 | 99.152 |
| 902.0 | 99.153 |
| 901.0 | 99.166 |
| 900.0 | 99.163 |
| 899.0 | 99.165 |
| 898.0 | 99.176 |
| 897.0 | 99.18 |
| 896.0 | 99.177 |
| 895.0 | 99.198 |
| 894.0 | 99.216 |
| 893.0 | 99.222 |
| 892.0 | 99.252 |
| 891.0 | 99.272 |
| 890.0 | 99.291 |
| 889.0 | 99.306 |
| 888.0 | 99.332 |
| 887.0 | 99.337 |
| 886.0 | 99.322 |
| 885.0 | 99.338 |
| 884.0 | 99.341 |
| 883.0 | 99.33 |
| 882.0 | 99.35 |
| 881.0 | 99.355 |
| 880.0 | 99.349 |
| 879.0 | 99.353 |
| 878.0 | 99.368 |
| 877.0 | 99.367 |
| 876.0 | 99.38 |
| 875.0 | 99.397 |
| 874.0 | 99.397 |
| 873.0 | 99.393 |
| 872.0 | 99.401 |
| 871.0 | 99.406 |
| 870.0 | 99.395 |
| 869.0 | 99.407 |
| 868.0 | 99.415 |
| 867.0 | 99.401 |
| 866.0 | 99.418 |
| 865.0 | 99.426 |
| 864.0 | 99.414 |
| 863.0 | 99.414 |
| 862.0 | 99.42 |
| 861.0 | 99.424 |
| 860.0 | 99.408 |
| 859.0 | 99.41 |
| 858.0 | 99.414 |
| 857.0 | 99.389 |
| 856.0 | 99.382 |
| 855.0 | 99.371 |
| 854.0 | 99.356 |
| 853.0 | 99.344 |
| 852.0 | 99.343 |
| 851.0 | 99.325 |
| 850.0 | 99.304 |
| 849.0 | 99.091 |
| 848.0 | 98.988 |
| 847.0 | 98.955 |
| 846.0 | 98.995 |
| 845.0 | 99.023 |
| 844.0 | 99.011 |
| 843.0 | 99.12 |
| 842.0 | 99.119 |
| 841.0 | 99.174 |
| 840.0 | 99.084 |
| 839.0 | 99.148 |
| 838.0 | 99.048 |
| 837.0 | 98.968 |
| 836.0 | 98.995 |
| 835.0 | 99.037 |
| 834.0 | 99.009 |
| 833.0 | 98.923 |
| 832.0 | 98.972 |
| 831.0 | 98.966 |
| 830.0 | 99.044 |
| 829.0 | 99.018 |
| 828.0 | 99.047 |
| 827.0 | 99.012 |
| 826.0 | 99.006 |
| 825.0 | 98.916 |
| 824.0 | 98.783 |
| 823.0 | 98.788 |
| 822.0 | 98.748 |
| 821.0 | 98.745 |
| 820.0 | 98.804 |
| 819.0 | 98.839 |
| 818.0 | 98.83 |
| 817.0 | 98.813 |
| 816.0 | 98.884 |
| 815.0 | 98.924 |
| 814.0 | 98.897 |
| 813.0 | 98.911 |
| 812.0 | 98.816 |
| 811.0 | 98.796 |
| 810.0 | 98.839 |
| 809.0 | 98.805 |
| 808.0 | 98.667 |
| 807.0 | 98.605 |
| 806.0 | 98.588 |
| 805.0 | 98.574 |
| 804.0 | 98.588 |
| 803.0 | 98.618 |
| 802.0 | 98.669 |
| 801.0 | 98.727 |
| 800.0 | 98.854 |
| 799.0 | 98.951 |
| 798.0 | 98.891 |
| 797.0 | 98.845 |
| 796.0 | 98.79 |
| 795.0 | 98.756 |
| 794.0 | 98.775 |
| 793.0 | 98.824 |
| 792.0 | 98.86 |
| 791.0 | 98.778 |
| 790.0 | 98.728 |
| 789.0 | 98.682 |
| 788.0 | 98.71 |
| 787.0 | 98.723 |
| 786.0 | 98.756 |
| 785.0 | 98.758 |
| 784.0 | 98.736 |
| 783.0 | 98.76 |
| 782.0 | 98.714 |
| 781.0 | 98.601 |
| 780.0 | 98.689 |
| 779.0 | 98.762 |
| 778.0 | 98.756 |
| 777.0 | 98.739 |
| 776.0 | 98.83 |
| 775.0 | 98.87 |
| 774.0 | 98.765 |
| 773.0 | 98.625 |
| 772.0 | 98.579 |
| 771.0 | 98.605 |
| 770.0 | 98.603 |
| 769.0 | 98.605 |
| 768.0 | 98.581 |
| 767.0 | 98.686 |
| 766.0 | 98.791 |
| 765.0 | 98.718 |
| 764.0 | 98.69 |
| 763.0 | 98.691 |
| 762.0 | 98.665 |
| 761.0 | 98.621 |
| 760.0 | 98.743 |
| 759.0 | 98.697 |
| 758.0 | 98.611 |
| 757.0 | 98.674 |
| 756.0 | 98.788 |
| 755.0 | 98.777 |
| 754.0 | 98.778 |
| 753.0 | 98.879 |
| 752.0 | 98.875 |
| 751.0 | 98.871 |
| 750.0 | 99.008 |
| 749.0 | 99.008 |
| 748.0 | 98.921 |
| 747.0 | 98.924 |
| 746.0 | 99.05 |
| 745.0 | 99.1 |
| 744.0 | 99.118 |
| 743.0 | 99.095 |
| 742.0 | 99.016 |
| 741.0 | 98.905 |
| 740.0 | 98.871 |
| 739.0 | 98.748 |
| 738.0 | 98.606 |
| 737.0 | 98.694 |
| 736.0 | 98.842 |
| 735.0 | 98.851 |
| 734.0 | 98.842 |
| 733.0 | 98.878 |
| 732.0 | 98.847 |
| 731.0 | 98.762 |
| 730.0 | 98.715 |
| 729.0 | 98.71 |
| 728.0 | 98.816 |
| 727.0 | 98.872 |
| 726.0 | 98.813 |
| 725.0 | 98.714 |
| 724.0 | 98.723 |
| 723.0 | 98.576 |
| 722.0 | 98.399 |
| 721.0 | 98.346 |
| 720.0 | 98.488 |
| 719.0 | 98.576 |
| 718.0 | 98.547 |
| 717.0 | 98.506 |
| 716.0 | 98.394 |
| 715.0 | 98.265 |
| 714.0 | 98.141 |
| 713.0 | 98.113 |
| 712.0 | 98.032 |
| 711.0 | 97.855 |
| 710.0 | 97.765 |
| 709.0 | 97.625 |
| 708.0 | 97.562 |
| 707.0 | 97.774 |
| 706.0 | 98.019 |
| 705.0 | 98.051 |
| 704.0 | 98.041 |
| 703.0 | 97.973 |
| 702.0 | 97.911 |
| 701.0 | 97.847 |
| 700.0 | 97.787 |
| 699.0 | 97.841 |
| 698.0 | 97.842 |
| 697.0 | 97.68 |
| 696.0 | 97.569 |
| 695.0 | 97.597 |
| 694.0 | 97.592 |
| 693.0 | 97.485 |
| 692.0 | 97.37 |
| 691.0 | 97.248 |
| 690.0 | 97.054 |
| 689.0 | 96.674 |
| 688.0 | 96.315 |
| 687.0 | 96.126 |
| 686.0 | 96.108 |
| 685.0 | 96.297 |
| 684.0 | 96.408 |
| 683.0 | 96.266 |
| 682.0 | 96.311 |
| 681.0 | 96.62 |
| 680.0 | 96.817 |
| 679.0 | 96.857 |
| 678.0 | 96.77 |
| 677.0 | 95.337 |
| 676.0 | 88.966 |
| 675.0 | 71.617 |
| 674.0 | 45.336 |
| 673.0 | 25.253 |
| 672.0 | 16 |
| 671.0 | 10.19 |
| 670.0 | 6.858 |
| 669.0 | 5.481 |
| 668.0 | 4.367 |
| 667.0 | 3.117 |
| 666.0 | 1.874 |
| 665.0 | 1.143 |
| 664.0 | 1.018 |
| 663.0 | 1.102 |
| 662.0 | 0.769 |
| 661.0 | 0.281 |
| 660.0 | 0.049 |
| 659.0 | 0.004 |
| 658.0 | 0.004 |
| 657.0 | 0.004 |
| 656.0 | 0.004 |
| 655.0 | 0.004 |
| 654.0 | 0.004 |
| 653.0 | 0.004 |
| 652.0 | 0.004 |
| 651.0 | 0.004 |
| 650.0 | 0.004 |
| 649.0 | 0.004 |
| 648.0 | 0.004 |
| 647.0 | 0.004 |
| 646.0 | 0.004 |
| 645.0 | 0.004 |
| 644.0 | 0.004 |
| 643.0 | 0.004 |
| 642.0 | 0.004 |
| 641.0 | 0.004 |
| 640.0 | 0.004 |
| 639.0 | 0.004 |
| 638.0 | 0.004 |
| 637.0 | 0.004 |
| 636.0 | 0.004 |
| 635.0 | 0.004 |
| 634.0 | 0.004 |
| 633.0 | 0.004 |
| 632.0 | 0.004 |
| 631.0 | 0.004 |
| 630.0 | 0.004 |
| 629.0 | 0.004 |
| 628.0 | 0.004 |
| 627.0 | 0.004 |
| 626.0 | 0.004 |
| 625.0 | 0.004 |
| 624.0 | 0.004 |
| 623.0 | 0.004 |
| 622.0 | 0.004 |
| 621.0 | 0.004 |
| 620.0 | 0.004 |
| 619.0 | 0.004 |
| 618.0 | 0.004 |
| 617.0 | 0.004 |
| 616.0 | 0.004 |
| 615.0 | 0.004 |
| 614.0 | 0.004 |
| 613.0 | 0.004 |
| 612.0 | 0.004 |
| 611.0 | 0.004 |
| 610.0 | 0.004 |
| 609.0 | 0.004 |
| 608.0 | 0.004 |
| 607.0 | 0.004 |
| 606.0 | 0.004 |
| 605.0 | 0.004 |
| 604.0 | 0.004 |
| 603.0 | 0.004 |
| 602.0 | 0.004 |
| 601.0 | 0.004 |
| 600.0 | 0.004 |
| 599.0 | 0.004 |
| 598.0 | 0.004 |
| 597.0 | 0.004 |
| 596.0 | 0.004 |
| 595.0 | 0.004 |
| 594.0 | 0.004 |
| 593.0 | 0.004 |
| 592.0 | 0.004 |
| 591.0 | 0.004 |
| 590.0 | 0.004 |
| 589.0 | 0.004 |
| 588.0 | 0.004 |
| 587.0 | 0.004 |
| 586.0 | 0.004 |
| 585.0 | 0.004 |
| 584.0 | 0.004 |
| 583.0 | 0.004 |
| 582.0 | 0.004 |
| 581.0 | 0.004 |
| 580.0 | 0.004 |
| 579.0 | 0.004 |
| 578.0 | 0.003 |
| 577.0 | 0.004 |
| 576.0 | 0.004 |
| 575.0 | 0.004 |
| 574.0 | 0.004 |
| 573.0 | 0.004 |
| 572.0 | 0.004 |
| 571.0 | 0.004 |
| 570.0 | 0.003 |
| 569.0 | 0.004 |
| 568.0 | 0.003 |
| 567.0 | 0.004 |
| 566.0 | 0.003 |
| 565.0 | 0.003 |
| 564.0 | 0.003 |
| 563.0 | 0.003 |
| 562.0 | 0.003 |
| 561.0 | 0.003 |
| 560.0 | 0.003 |
| 559.0 | 0.003 |
| 558.0 | 0.003 |
| 557.0 | 0.003 |
| 556.0 | 0.003 |
| 555.0 | 0.003 |
| 554.0 | 0.003 |
| 553.0 | 0.003 |
| 552.0 | 0.003 |
| 551.0 | 0.003 |
| 550.0 | 0.003 |
| 549.0 | 0.003 |
| 548.0 | 0.003 |
| 547.0 | 0.003 |
| 546.0 | 0.003 |
| 545.0 | 0.003 |
| 544.0 | 0.003 |
| 543.0 | 0.003 |
| 542.0 | 0.003 |
| 541.0 | 0.003 |
| 540.0 | 0.003 |
| 539.0 | 0.003 |
| 538.0 | 0.003 |
| 537.0 | 0.003 |
| 536.0 | 0.003 |
| 535.0 | 0.003 |
| 534.0 | 0.003 |
| 533.0 | 0.003 |
| 532.0 | 0.003 |
| 531.0 | 0.003 |
| 530.0 | 0.003 |
| 529.0 | 0.003 |
| 528.0 | 0.003 |
| 527.0 | 0.003 |
| 526.0 | 0.003 |
| 525.0 | 0.003 |
| 524.0 | 0.003 |
| 523.0 | 0.003 |
| 522.0 | 0.003 |
| 521.0 | 0.003 |
| 520.0 | 0.003 |
| 519.0 | 0.003 |
| 518.0 | 0.003 |
| 517.0 | 0.003 |
| 516.0 | 0.003 |
| 515.0 | 0.003 |
| 514.0 | 0.003 |
| 513.0 | 0.003 |
| 512.0 | 0.003 |
| 511.0 | 0.003 |
| 510.0 | 0.003 |
| 509.0 | 0.003 |
| 508.0 | 0.003 |
| 507.0 | 0.003 |
| 506.0 | 0.003 |
| 505.0 | 0.003 |
| 504.0 | 0.003 |
| 503.0 | 0.003 |
| 502.0 | 0.003 |
| 501.0 | 0.003 |
| 500.0 | 0.003 |
| 499.0 | 0.003 |
| 498.0 | 0.003 |
| 497.0 | 0.003 |
| 496.0 | 0.003 |
| 495.0 | 0.003 |
| 494.0 | 0.003 |
| 493.0 | 0.003 |
| 492.0 | 0.003 |
| 491.0 | 0.003 |
| 490.0 | 0.003 |
| 489.0 | 0.003 |
| 488.0 | 0.003 |
| 487.0 | 0.003 |
| 486.0 | 0.003 |
| 485.0 | 0.003 |
| 484.0 | 0.002 |
| 483.0 | 0.003 |
| 482.0 | 0.003 |
| 481.0 | 0.003 |
| 480.0 | 0.003 |
| 479.0 | 0.016 |
| 478.0 | 0.117 |
| 477.0 | 0.22 |
| 476.0 | 0.18 |
| 475.0 | 0.086 |
| 474.0 | 0.063 |
| 473.0 | 0.099 |
| 472.0 | 0.142 |
| 471.0 | 0.487 |
| 470.0 | 3.608 |
| 469.0 | 7.384 |
| 468.0 | 6.937 |
| 467.0 | 4.362 |
| 466.0 | 5.703 |
| 465.0 | 12.572 |
| 464.0 | 16.885 |
| 463.0 | 10.623 |
| 462.0 | 3.039 |
| 461.0 | 1.261 |
| 460.0 | 1.557 |
| 459.0 | 1.702 |
| 458.0 | 1.453 |
| 457.0 | 1.931 |
| 456.0 | 7.478 |
| 455.0 | 13.229 |
| 454.0 | 10.134 |
| 453.0 | 3.636 |
| 452.0 | 0.79 |
| 451.0 | 1.997 |
| 450.0 | 4.566 |
| 449.0 | 5.431 |
| 448.0 | 3.005 |
| 447.0 | 1.356 |
| 446.0 | 3.026 |
| 445.0 | 4.753 |
| 444.0 | 4.232 |
| 443.0 | 3.717 |
| 442.0 | 9.683 |
| 441.0 | 17.517 |
| 440.0 | 16.003 |
| 439.0 | 11.248 |
| 438.0 | 12.53 |
| 437.0 | 16.15 |
| 436.0 | 17.163 |
| 435.0 | 16.04 |
| 434.0 | 11.001 |
| 433.0 | 4.975 |
| 432.0 | 3.118 |
| 431.0 | 4.343 |
| 430.0 | 4.527 |
| 429.0 | 4.301 |
| 428.0 | 5.057 |
| 427.0 | 4.887 |
| 426.0 | 3.62 |
| 425.0 | 2.687 |
| 424.0 | 1.959 |
| 423.0 | 1.731 |
| 422.0 | 1.677 |
| 421.0 | 0.877 |
| 420.0 | 0.109 |
| 419.0 | 0.005 |
| 418.0 | 0.003 |
| 417.0 | 0.003 |
| 416.0 | 0.001 |
| 415.0 | 0.002 |
| 414.0 | 0.002 |
| 413.0 | 0.001 |
| 412.0 | 0.002 |
| 411.0 | 0.003 |
| 410.0 | 0.003 |
| 409.0 | 0.003 |
| 408.0 | 0.003 |
| 407.0 | 0.003 |
| 406.0 | 0.003 |
| 405.0 | 0.003 |
| 404.0 | 0.003 |
| 403.0 | 0.003 |
| 402.0 | 0.003 |
| 401.0 | 0.003 |
| 400.0 | 0.003 |
| 399.0 | 0.003 |
| 398.0 | 0.003 |
| 397.0 | 0.003 |
| 396.0 | 0.003 |
| 395.0 | 0.003 |
| 394.0 | 0.001 |
| 393.0 | 0.042 |
| 392.0 | 0.103 |
| 391.0 | 0.096 |
| 390.0 | 0.04 |
| 389.0 | 0.005 |
| 388.0 | 0.004 |
| 387.0 | 0.005 |
| 386.0 | 0.032 |
| 385.0 | 0.076 |
| 384.0 | 0.079 |
| 383.0 | 0.044 |
| 382.0 | 0.044 |
| 381.0 | 0.068 |
| 380.0 | 0.053 |
| 379.0 | 0.017 |
| 378.0 | 0.002 |
| 377.0 | 0.006 |
| 376.0 | 0.03 |
| 375.0 | 0.049 |
| 374.0 | 0.031 |
| 373.0 | 0.01 |
| 372.0 | 0.003 |
| 371.0 | 0.002 |
| 370.0 | 0.001 |
| 369.0 | 0.002 |
| 368.0 | 0.007 |
| 367.0 | 0.06 |
| 366.0 | 0.165 |
| 365.0 | 0.224 |
| 364.0 | 0.146 |
| 363.0 | 0.045 |
| 362.0 | 0.13 |
| 361.0 | 0.432 |
| 360.0 | 0.785 |
| 359.0 | 0.838 |
| 358.0 | 0.611 |
| 357.0 | 0.343 |
| 356.0 | 0.144 |
| 355.0 | 0.155 |
| 354.0 | 0.357 |
| 353.0 | 0.478 |
| 352.0 | 0.313 |
| 351.0 | 0.089 |
| 350.0 | 0.003 |
| 349.0 | 0 |
| 348.0 | 0 |
| 347.0 | 0 |
| 346.0 | 0 |
| 345.0 | 0 |
| 344.0 | 0 |
| 343.0 | 0 |
| 342.0 | 0 |
| 341.0 | 0 |
| 340.0 | 0 |
| 339.0 | 0.002 |
| 338.0 | 0.002 |
| 337.0 | 0.002 |
| 336.0 | 0.002 |
| 335.0 | 0.002 |
| 334.0 | 0.002 |
| 333.0 | 0.002 |
| 332.0 | 0.002 |
| 331.0 | 0.002 |
| 330.0 | 0.002 |
| 329.0 | 0.002 |
| 328.0 | 0.002 |
| 327.0 | 0.002 |
| 326.0 | 0.002 |
| 325.0 | 0.002 |
| 324.0 | 0.002 |
| 323.0 | 0.002 |
| 322.0 | 0.002 |
| 321.0 | 0.002 |
| 320.0 | 0.002 |
| 319.0 | 0.002 |
| 318.0 | 0.002 |
| 317.0 | 0.002 |
| 316.0 | 0.002 |
| 315.0 | 0.002 |
| 314.0 | 0.002 |
| 313.0 | 0.002 |
| 312.0 | 0.002 |
| 311.0 | 0.002 |
| 310.0 | 0.002 |
| 309.0 | 0.002 |
| 308.0 | 0.002 |
| 307.0 | 0.002 |
| 306.0 | 0.002 |
| 305.0 | 0.002 |
| 304.0 | 0.002 |
| 303.0 | 0.002 |
| 302.0 | 0.002 |
| 301.0 | 0.002 |
| 300.0 | 0.002 |
| 299.0 | 0.002 |
| 298.0 | 0.002 |
| 297.0 | 0.002 |
| 296.0 | 0.002 |
| 295.0 | 0.002 |
| 294.0 | 0.002 |
| 293.0 | 0.002 |
| 292.0 | 0.003 |
| 291.0 | 0.002 |
| 290.0 | 0.002 |
| 289.0 | 0.003 |
| 288.0 | 0.002 |
| 287.0 | 0.003 |
| 286.0 | 0.003 |
| 285.0 | 0.003 |
| 284.0 | 0.003 |
| 283.0 | 0.003 |
| 282.0 | 0.003 |
| 281.0 | 0.003 |
| 280.0 | 0.003 |
| 279.0 | 0.003 |
| 278.0 | 0.003 |
| 277.0 | 0.003 |
| 276.0 | 0.003 |
| 275.0 | 0.003 |
| 274.0 | 0.003 |
| 273.0 | 0.003 |
| 272.0 | 0.003 |
| 271.0 | 0.003 |
| 270.0 | 0.003 |
| 269.0 | 0.003 |
| 268.0 | 0.003 |
| 267.0 | 0.003 |
| 266.0 | 0.003 |
| 265.0 | 0.003 |
| 264.0 | 0.003 |
| 263.0 | 0.003 |
| 262.0 | 0.003 |
| 261.0 | 0.003 |
| 260.0 | 0.003 |
| 259.0 | 0.003 |
| 258.0 | 0.003 |
| 257.0 | 0.003 |
| 256.0 | 0.003 |
| 255.0 | 0.003 |
| 254.0 | 0.003 |
| 253.0 | 0.003 |
| 252.0 | 0.003 |
| 251.0 | 0.003 |
| 250.0 | 0.003 |
| 249.0 | 0.003 |
| 248.0 | 0.003 |
| 247.0 | 0.003 |
| 246.0 | 0.003 |
| 245.0 | 0.003 |
| 244.0 | 0.003 |
| 243.0 | 0.003 |
| 242.0 | 0.003 |
| 241.0 | 0.003 |
| 240.0 | 0.003 |
| 239.0 | 0.003 |
| 238.0 | 0.003 |
| 237.0 | 0.003 |
| 236.0 | 0.003 |
| 235.0 | 0.003 |
| 234.0 | 0.003 |
| 233.0 | 0.003 |
| 232.0 | 0.003 |
| 231.0 | 0.003 |
| 230.0 | 0.003 |
| 229.0 | 0.003 |
| 228.0 | 0.003 |
| 227.0 | 0.003 |
| 226.0 | 0.003 |
| 225.0 | 0.003 |
| 224.0 | 0.003 |
| 223.0 | 0.003 |
| 222.0 | 0.003 |
| 221.0 | 0.003 |
| 220.0 | 0.003 |
| 219.0 | 0.003 |
| 218.0 | 0.003 |
| 217.0 | 0.003 |
| 216.0 | 0.003 |
| 215.0 | 0.003 |
| 214.0 | 0.003 |
| 213.0 | 0.003 |
| 212.0 | 0.003 |
| 211.0 | 0.003 |
| 210.0 | 0.003 |
| 209.0 | 0.003 |
| 208.0 | 0.003 |
| 207.0 | 0.003 |
| 206.0 | 0.003 |
| 205.0 | 0.003 |
| 204.0 | 0.003 |
| 203.0 | 0.002 |
| 202.0 | 0.003 |
| 201.0 | 0.003 |